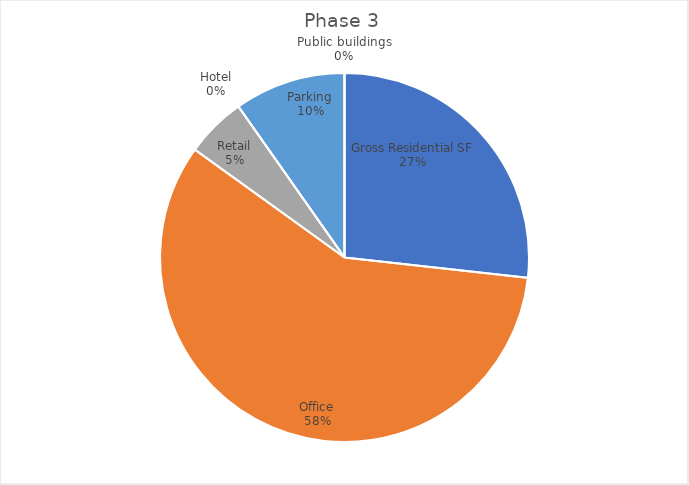
| Category | Series 0 |
|---|---|
| Gross Residential SF | 310619.328 |
| Office | 675468.817 |
|  Retail  | 61712.851 |
| Hotel | 0 |
| Parking | 113150 |
| Public buildings | 0 |